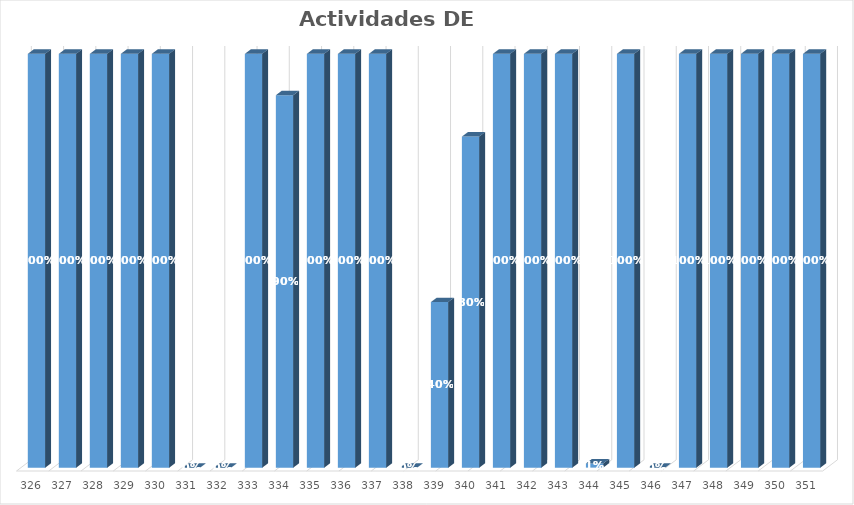
| Category | % Avance |
|---|---|
| 326.0 | 1 |
| 327.0 | 1 |
| 328.0 | 1 |
| 329.0 | 1 |
| 330.0 | 1 |
| 331.0 | 0 |
| 332.0 | 0 |
| 333.0 | 1 |
| 334.0 | 0.9 |
| 335.0 | 1 |
| 336.0 | 1 |
| 337.0 | 1 |
| 338.0 | 0 |
| 339.0 | 0.4 |
| 340.0 | 0.8 |
| 341.0 | 1 |
| 342.0 | 1 |
| 343.0 | 1 |
| 344.0 | 0.01 |
| 345.0 | 1 |
| 346.0 | 0 |
| 347.0 | 1 |
| 348.0 | 1 |
| 349.0 | 1 |
| 350.0 | 1 |
| 351.0 | 1 |